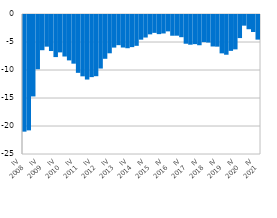
| Category | Current account 
(% of GDP) |
|---|---|
| IV
2008 | -20.831 |
| I | -20.604 |
| II | -14.542 |
| III | -9.688 |
| IV
2009 | -6.289 |
| I | -5.655 |
| II | -6.435 |
| III | -7.516 |
| IV
2010 | -6.677 |
| I | -7.414 |
| II | -8.105 |
| III | -8.69 |
| IV
2011 | -10.33 |
| I | -10.953 |
| II | -11.525 |
| III | -11.095 |
| IV
2012 | -10.931 |
| I | -9.56 |
| II | -7.822 |
| III | -6.839 |
| IV
2013 | -5.821 |
| I | -5.386 |
| II | -5.809 |
| III | -5.933 |
| IV
2014 | -5.738 |
| I | -5.505 |
| II | -4.407 |
| III | -4.024 |
| IV
2015 | -3.455 |
| I | -3.193 |
| II | -3.417 |
| III | -3.297 |
| IV
2016 | -2.926 |
| I | -3.702 |
| II | -3.696 |
| III | -3.964 |
| IV
2017 | -5.131 |
| I | -5.304 |
| II | -5.203 |
| III | -5.4 |
| IV
2018 | -4.844 |
| I | -4.923 |
| II | -5.624 |
| III | -5.654 |
| IV
2019 | -6.852 |
| I | -7.095 |
| II | -6.405 |
| III | -6.141 |
| IV
2020 | -4.122 |
| I | -1.902 |
| II | -2.542 |
| III | -3.034 |
| IV
2021 | -4.395 |